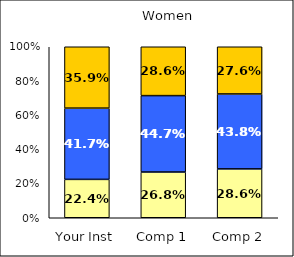
| Category | Low Pluralistic Orientation | Average Pluralistic Orientation | High Pluralistic Orientation |
|---|---|---|---|
| Your Inst | 0.224 | 0.417 | 0.359 |
| Comp 1 | 0.268 | 0.447 | 0.286 |
| Comp 2 | 0.286 | 0.438 | 0.276 |